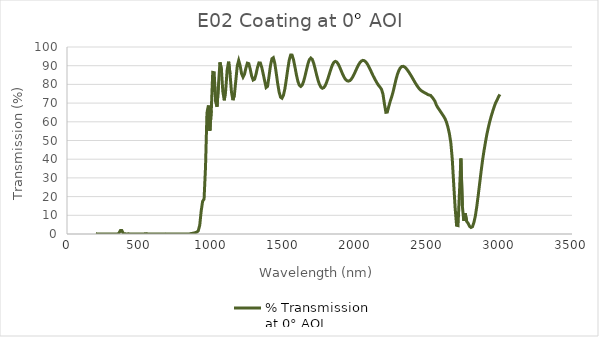
| Category | % Transmission 
at 0° AOI |
|---|---|
| 200.0 | 0.177 |
| 210.0 | 0.016 |
| 220.0 | 0.028 |
| 230.0 | 0.001 |
| 240.0 | 0.009 |
| 250.0 | 0.001 |
| 260.0 | 0.036 |
| 270.0 | 0.021 |
| 280.0 | 0.023 |
| 290.0 | 0.018 |
| 300.0 | 0.01 |
| 310.0 | 0.003 |
| 320.0 | 0.013 |
| 330.0 | 0.013 |
| 340.0 | 0.011 |
| 350.0 | 0.005 |
| 360.0 | 0.481 |
| 370.0 | 1.834 |
| 380.0 | 1.895 |
| 390.0 | 0.24 |
| 400.0 | 0.112 |
| 410.0 | 0.058 |
| 420.0 | 0.067 |
| 430.0 | 0.077 |
| 440.0 | 0.021 |
| 450.0 | 0.009 |
| 460.0 | 0.022 |
| 470.0 | 0.01 |
| 480.0 | 0.009 |
| 490.0 | 0.027 |
| 500.0 | 0.025 |
| 510.0 | 0.005 |
| 520.0 | 0.001 |
| 530.0 | 0.016 |
| 540.0 | 0.115 |
| 550.0 | 0.198 |
| 560.0 | 0.055 |
| 570.0 | 0.009 |
| 580.0 | 0.008 |
| 590.0 | 0.004 |
| 600.0 | 0.005 |
| 610.0 | 0.023 |
| 620.0 | 0.036 |
| 630.0 | 0.025 |
| 640.0 | 0.048 |
| 650.0 | 0.053 |
| 660.0 | 0.016 |
| 670.0 | 0.031 |
| 680.0 | 0.067 |
| 690.0 | 0.03 |
| 700.0 | 0.008 |
| 710.0 | 0.005 |
| 720.0 | 0.009 |
| 730.0 | 0.007 |
| 740.0 | 0.005 |
| 750.0 | 0.013 |
| 760.0 | 0.052 |
| 770.0 | 0.041 |
| 780.0 | 0.004 |
| 790.0 | 0.042 |
| 800.0 | 0.051 |
| 810.0 | 0.036 |
| 820.0 | 0.023 |
| 830.0 | 0.01 |
| 840.0 | 0.008 |
| 850.0 | 0.043 |
| 860.0 | 0.249 |
| 870.0 | 0.369 |
| 880.0 | 0.542 |
| 890.0 | 0.74 |
| 900.0 | 1.052 |
| 910.0 | 1.786 |
| 920.0 | 4.735 |
| 930.0 | 12.291 |
| 940.0 | 17.508 |
| 950.0 | 18.701 |
| 960.0 | 35.738 |
| 970.0 | 64.756 |
| 980.0 | 68.713 |
| 990.0 | 55.242 |
| 1000.0 | 66.087 |
| 1010.0 | 86.417 |
| 1020.0 | 86.273 |
| 1030.0 | 70.819 |
| 1040.0 | 68.047 |
| 1050.0 | 79.908 |
| 1060.0 | 91.778 |
| 1070.0 | 88.241 |
| 1080.0 | 76.18 |
| 1090.0 | 71.497 |
| 1100.0 | 77.174 |
| 1110.0 | 87.728 |
| 1120.0 | 92.134 |
| 1130.0 | 85.459 |
| 1140.0 | 75.916 |
| 1150.0 | 71.577 |
| 1160.0 | 74.269 |
| 1170.0 | 81.988 |
| 1180.0 | 89.89 |
| 1190.0 | 92.815 |
| 1200.0 | 90.022 |
| 1210.0 | 85.743 |
| 1220.0 | 83.923 |
| 1230.0 | 85.401 |
| 1240.0 | 88.759 |
| 1250.0 | 91.353 |
| 1260.0 | 91.112 |
| 1270.0 | 88.097 |
| 1280.0 | 84.416 |
| 1290.0 | 82.336 |
| 1300.0 | 82.763 |
| 1310.0 | 85.4 |
| 1320.0 | 88.988 |
| 1330.0 | 91.508 |
| 1340.0 | 91.487 |
| 1350.0 | 89.049 |
| 1360.0 | 85.527 |
| 1370.0 | 81.876 |
| 1380.0 | 78.335 |
| 1390.0 | 78.954 |
| 1400.0 | 84.255 |
| 1410.0 | 89.939 |
| 1420.0 | 93.694 |
| 1430.0 | 94.27 |
| 1440.0 | 91.341 |
| 1450.0 | 86.165 |
| 1460.0 | 80.567 |
| 1470.0 | 75.945 |
| 1480.0 | 73.191 |
| 1490.0 | 72.616 |
| 1500.0 | 74.136 |
| 1510.0 | 77.622 |
| 1520.0 | 82.642 |
| 1530.0 | 88.18 |
| 1540.0 | 92.916 |
| 1550.0 | 95.667 |
| 1560.0 | 95.658 |
| 1570.0 | 93.156 |
| 1580.0 | 89.275 |
| 1590.0 | 85.139 |
| 1600.0 | 81.704 |
| 1610.0 | 79.582 |
| 1620.0 | 78.905 |
| 1630.0 | 79.624 |
| 1640.0 | 81.634 |
| 1650.0 | 84.544 |
| 1660.0 | 87.849 |
| 1670.0 | 90.988 |
| 1680.0 | 93.276 |
| 1690.0 | 94.114 |
| 1700.0 | 93.374 |
| 1710.0 | 91.247 |
| 1720.0 | 88.272 |
| 1730.0 | 85.082 |
| 1740.0 | 82.223 |
| 1750.0 | 79.941 |
| 1760.0 | 78.469 |
| 1770.0 | 77.939 |
| 1780.0 | 78.281 |
| 1790.0 | 79.411 |
| 1800.0 | 81.246 |
| 1810.0 | 83.515 |
| 1820.0 | 85.973 |
| 1830.0 | 88.427 |
| 1840.0 | 90.511 |
| 1850.0 | 91.849 |
| 1860.0 | 92.33 |
| 1870.0 | 91.964 |
| 1880.0 | 90.842 |
| 1890.0 | 89.228 |
| 1900.0 | 87.4 |
| 1910.0 | 85.534 |
| 1920.0 | 83.92 |
| 1930.0 | 82.697 |
| 1940.0 | 81.975 |
| 1950.0 | 81.749 |
| 1960.0 | 82.033 |
| 1970.0 | 82.786 |
| 1980.0 | 83.93 |
| 1990.0 | 85.435 |
| 2000.0 | 87.144 |
| 2010.0 | 88.835 |
| 2020.0 | 90.386 |
| 2030.0 | 91.636 |
| 2040.0 | 92.488 |
| 2050.0 | 92.844 |
| 2060.0 | 92.702 |
| 2070.0 | 92.098 |
| 2080.0 | 91.1 |
| 2090.0 | 89.756 |
| 2100.0 | 88.213 |
| 2110.0 | 86.546 |
| 2120.0 | 84.882 |
| 2130.0 | 83.363 |
| 2140.0 | 81.947 |
| 2150.0 | 80.584 |
| 2160.0 | 79.419 |
| 2170.0 | 78.478 |
| 2180.0 | 77.336 |
| 2190.0 | 74.756 |
| 2200.0 | 69.598 |
| 2210.0 | 65.084 |
| 2220.0 | 65.195 |
| 2230.0 | 68.146 |
| 2240.0 | 70.93 |
| 2250.0 | 73.258 |
| 2260.0 | 76.007 |
| 2270.0 | 79.298 |
| 2280.0 | 82.607 |
| 2290.0 | 85.365 |
| 2300.0 | 87.431 |
| 2310.0 | 88.825 |
| 2320.0 | 89.557 |
| 2330.0 | 89.673 |
| 2340.0 | 89.305 |
| 2350.0 | 88.592 |
| 2360.0 | 87.61 |
| 2370.0 | 86.481 |
| 2380.0 | 85.276 |
| 2390.0 | 84.001 |
| 2400.0 | 82.624 |
| 2410.0 | 81.295 |
| 2420.0 | 80.028 |
| 2430.0 | 78.844 |
| 2440.0 | 77.82 |
| 2450.0 | 76.995 |
| 2460.0 | 76.392 |
| 2470.0 | 75.927 |
| 2480.0 | 75.489 |
| 2490.0 | 75.081 |
| 2500.0 | 74.592 |
| 2510.0 | 74.318 |
| 2520.0 | 74.096 |
| 2530.0 | 73.25 |
| 2540.0 | 72.171 |
| 2550.0 | 71.009 |
| 2560.0 | 68.949 |
| 2570.0 | 67.596 |
| 2580.0 | 66.462 |
| 2590.0 | 65.303 |
| 2600.0 | 64.175 |
| 2610.0 | 63 |
| 2620.0 | 61.676 |
| 2630.0 | 59.817 |
| 2640.0 | 57.148 |
| 2650.0 | 53.745 |
| 2660.0 | 48.946 |
| 2670.0 | 40.187 |
| 2680.0 | 26.937 |
| 2690.0 | 13.991 |
| 2700.0 | 4.647 |
| 2710.0 | 4.482 |
| 2720.0 | 22.171 |
| 2730.0 | 40.393 |
| 2740.0 | 15.085 |
| 2750.0 | 7.062 |
| 2760.0 | 11.07 |
| 2770.0 | 6.738 |
| 2780.0 | 5.76 |
| 2790.0 | 4.12 |
| 2800.0 | 3.489 |
| 2810.0 | 3.882 |
| 2820.0 | 6.095 |
| 2830.0 | 9.549 |
| 2840.0 | 14.636 |
| 2850.0 | 20.635 |
| 2860.0 | 27.026 |
| 2870.0 | 33.429 |
| 2880.0 | 39.371 |
| 2890.0 | 44.488 |
| 2900.0 | 49.017 |
| 2910.0 | 53.277 |
| 2920.0 | 56.863 |
| 2930.0 | 60.106 |
| 2940.0 | 62.934 |
| 2950.0 | 65.469 |
| 2960.0 | 67.897 |
| 2970.0 | 69.99 |
| 2980.0 | 71.543 |
| 2990.0 | 73.249 |
| 3000.0 | 74.647 |